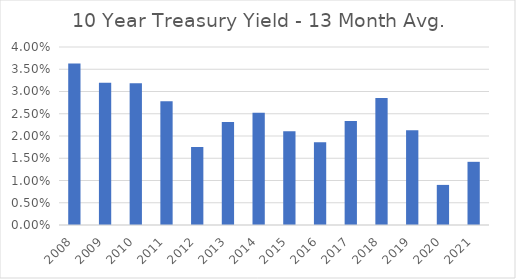
| Category | Series 0 |
|---|---|
| 2008.0 | 0.036 |
| 2009.0 | 0.032 |
| 2010.0 | 0.032 |
| 2011.0 | 0.028 |
| 2012.0 | 0.018 |
| 2013.0 | 0.023 |
| 2014.0 | 0.025 |
| 2015.0 | 0.021 |
| 2016.0 | 0.019 |
| 2017.0 | 0.023 |
| 2018.0 | 0.029 |
| 2019.0 | 0.021 |
| 2020.0 | 0.009 |
| 2021.0 | 0.014 |